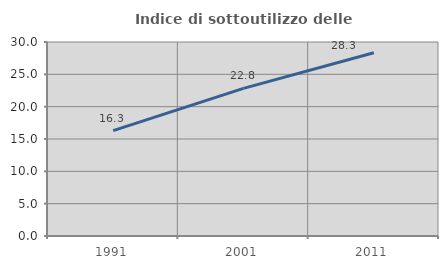
| Category | Indice di sottoutilizzo delle abitazioni  |
|---|---|
| 1991.0 | 16.298 |
| 2001.0 | 22.835 |
| 2011.0 | 28.345 |